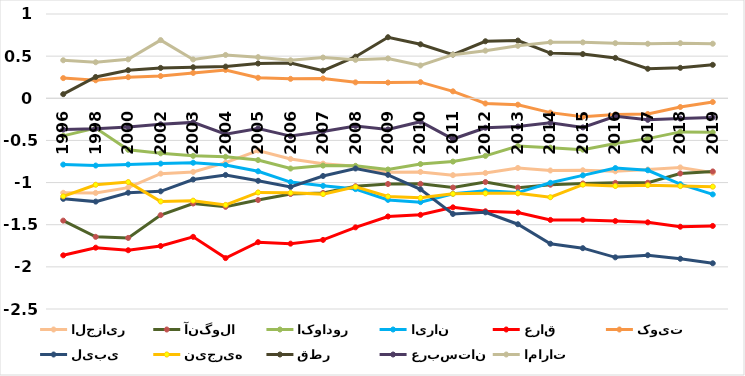
| Category | الجزایر | آنگولا | اکوادور | ایران | عراق | کویت | لیبی | نیجریه | قطر | عربستان | امارات |
|---|---|---|---|---|---|---|---|---|---|---|---|
| 1996.0 | -1.121 | -1.451 | -0.446 | -0.786 | -1.863 | 0.239 | -1.193 | -1.163 | 0.049 | -0.371 | 0.451 |
| 1998.0 | -1.123 | -1.644 | -0.353 | -0.798 | -1.772 | 0.214 | -1.226 | -1.026 | 0.253 | -0.36 | 0.428 |
| 2000.0 | -1.06 | -1.657 | -0.611 | -0.786 | -1.803 | 0.251 | -1.121 | -0.994 | 0.333 | -0.34 | 0.462 |
| 2002.0 | -0.894 | -1.386 | -0.653 | -0.775 | -1.752 | 0.264 | -1.104 | -1.224 | 0.36 | -0.308 | 0.69 |
| 2003.0 | -0.873 | -1.248 | -0.683 | -0.765 | -1.644 | 0.301 | -0.963 | -1.215 | 0.368 | -0.286 | 0.461 |
| 2004.0 | -0.763 | -1.287 | -0.694 | -0.791 | -1.896 | 0.336 | -0.91 | -1.265 | 0.376 | -0.425 | 0.514 |
| 2005.0 | -0.619 | -1.207 | -0.733 | -0.866 | -1.707 | 0.243 | -0.979 | -1.117 | 0.413 | -0.359 | 0.488 |
| 2006.0 | -0.72 | -1.136 | -0.833 | -0.994 | -1.725 | 0.231 | -1.052 | -1.122 | 0.419 | -0.449 | 0.451 |
| 2007.0 | -0.775 | -1.123 | -0.799 | -1.039 | -1.68 | 0.235 | -0.922 | -1.137 | 0.327 | -0.393 | 0.483 |
| 2008.0 | -0.805 | -1.044 | -0.802 | -1.077 | -1.531 | 0.189 | -0.833 | -1.051 | 0.494 | -0.328 | 0.456 |
| 2009.0 | -0.877 | -1.017 | -0.845 | -1.206 | -1.402 | 0.187 | -0.908 | -1.165 | 0.724 | -0.369 | 0.473 |
| 2010.0 | -0.874 | -1.015 | -0.78 | -1.232 | -1.383 | 0.192 | -1.08 | -1.181 | 0.641 | -0.277 | 0.389 |
| 2011.0 | -0.912 | -1.059 | -0.751 | -1.133 | -1.294 | 0.083 | -1.372 | -1.134 | 0.518 | -0.483 | 0.517 |
| 2012.0 | -0.886 | -0.994 | -0.684 | -1.097 | -1.341 | -0.062 | -1.353 | -1.128 | 0.677 | -0.35 | 0.565 |
| 2013.0 | -0.826 | -1.06 | -0.567 | -1.119 | -1.355 | -0.076 | -1.494 | -1.128 | 0.685 | -0.336 | 0.622 |
| 2014.0 | -0.857 | -1.025 | -0.586 | -1.003 | -1.443 | -0.17 | -1.725 | -1.174 | 0.536 | -0.291 | 0.665 |
| 2015.0 | -0.854 | -1.011 | -0.609 | -0.915 | -1.443 | -0.218 | -1.778 | -1.025 | 0.525 | -0.346 | 0.663 |
| 2016.0 | -0.866 | -1.003 | -0.537 | -0.828 | -1.456 | -0.193 | -1.887 | -1.041 | 0.479 | -0.214 | 0.654 |
| 2017.0 | -0.845 | -1.002 | -0.479 | -0.854 | -1.472 | -0.187 | -1.861 | -1.031 | 0.35 | -0.256 | 0.647 |
| 2018.0 | -0.82 | -0.892 | -0.399 | -1.019 | -1.524 | -0.103 | -1.904 | -1.042 | 0.361 | -0.241 | 0.654 |
| 2019.0 | -0.883 | -0.868 | -0.404 | -1.14 | -1.514 | -0.045 | -1.957 | -1.048 | 0.397 | -0.227 | 0.647 |